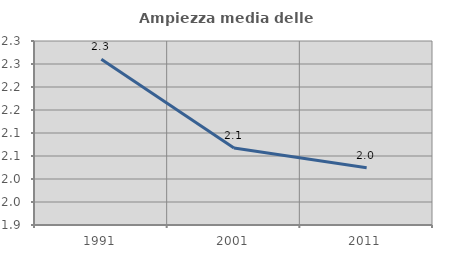
| Category | Ampiezza media delle famiglie |
|---|---|
| 1991.0 | 2.26 |
| 2001.0 | 2.068 |
| 2011.0 | 2.024 |